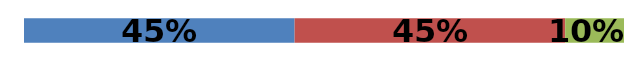
| Category | Series 0 | Series 1 | Series 2 |
|---|---|---|---|
| 0 | 0.451 | 0.451 | 0.098 |